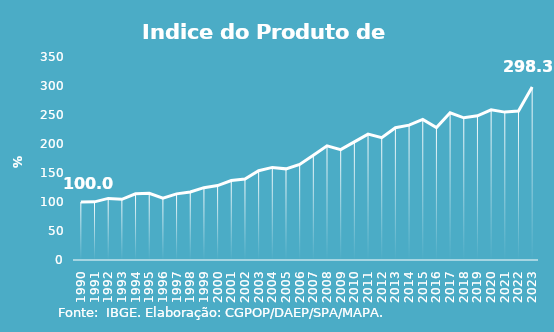
| Category | Indice de Prod. base 1990 |
|---|---|
| 1990.0 | 100 |
| 1991.0 | 100.275 |
| 1992.0 | 106.203 |
| 1993.0 | 104.57 |
| 1994.0 | 114.164 |
| 1995.0 | 115.024 |
| 1996.0 | 106.552 |
| 1997.0 | 114.037 |
| 1998.0 | 117.319 |
| 1999.0 | 124.734 |
| 2000.0 | 128.293 |
| 2001.0 | 136.975 |
| 2002.0 | 139.51 |
| 2003.0 | 153.868 |
| 2004.0 | 159.641 |
| 2005.0 | 157.136 |
| 2006.0 | 164.858 |
| 2007.0 | 180.781 |
| 2008.0 | 196.91 |
| 2009.0 | 190.309 |
| 2010.0 | 203.581 |
| 2011.0 | 217.041 |
| 2012.0 | 210.932 |
| 2013.0 | 228.009 |
| 2014.0 | 232.562 |
| 2015.0 | 242.318 |
| 2016.0 | 228.239 |
| 2017.0 | 253.826 |
| 2018.0 | 245.134 |
| 2019.0 | 248.619 |
| 2020.0 | 258.848 |
| 2021.0 | 254.988 |
| 2022.0 | 256.904 |
| 2023.0 | 298.279 |